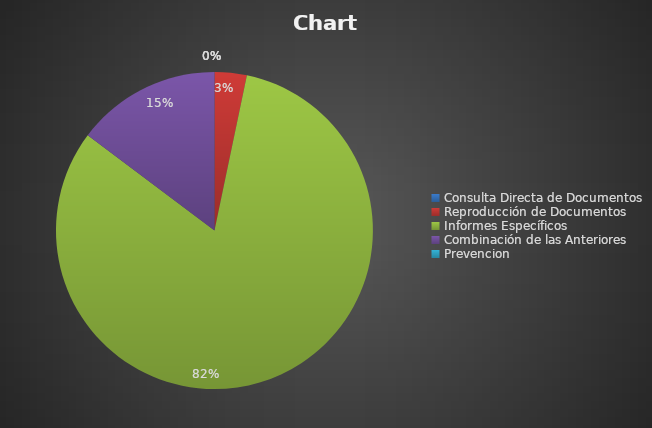
| Category | Series 0 |
|---|---|
| Consulta Directa de Documentos | 0 |
| Reproducción de Documentos | 10 |
| Informes Específicos | 250 |
| Combinación de las Anteriores | 45 |
| Prevencion | 0 |